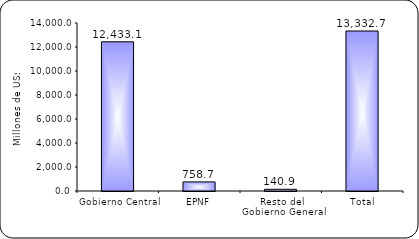
| Category | Series 1 |
|---|---|
| Gobierno Central | 12433.1 |
| EPNF | 758.7 |
| Resto del Gobierno General | 140.9 |
| Total | 13332.7 |